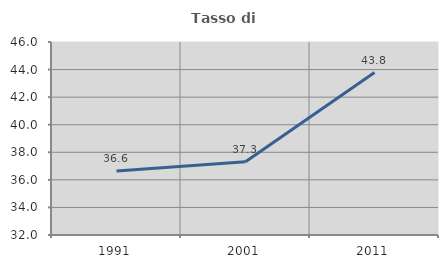
| Category | Tasso di occupazione   |
|---|---|
| 1991.0 | 36.645 |
| 2001.0 | 37.315 |
| 2011.0 | 43.782 |